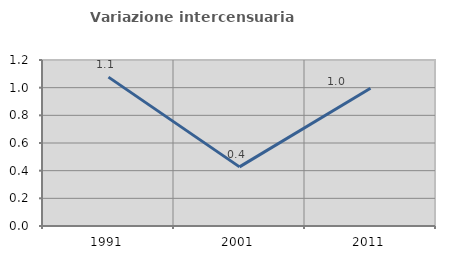
| Category | Variazione intercensuaria annua |
|---|---|
| 1991.0 | 1.076 |
| 2001.0 | 0.427 |
| 2011.0 | 0.995 |